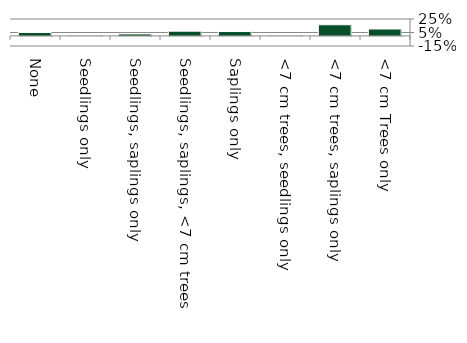
| Category | Non native |
|---|---|
| None | 0.05 |
| Seedlings only | 0 |
| Seedlings, saplings only | 0.029 |
| Seedlings, saplings, <7 cm trees | 0.07 |
| Saplings only | 0.064 |
| <7 cm trees, seedlings only | 0 |
| <7 cm trees, saplings only | 0.165 |
| <7 cm Trees only | 0.102 |